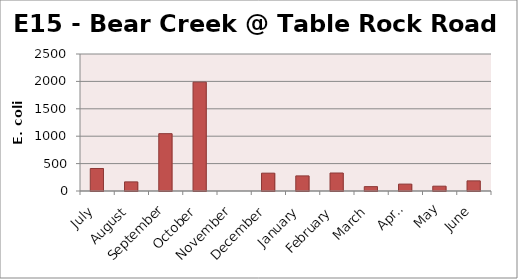
| Category | E. coli MPN |
|---|---|
| July | 410.6 |
| August | 166.4 |
| September | 1046.2 |
| October | 1986.3 |
| November | 0 |
| December | 325.5 |
| January | 275.5 |
| February | 328.2 |
| March | 79.8 |
| April | 125.9 |
| May | 88 |
| June | 185 |